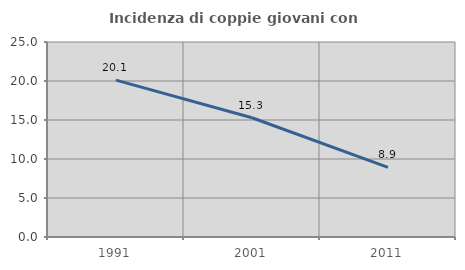
| Category | Incidenza di coppie giovani con figli |
|---|---|
| 1991.0 | 20.115 |
| 2001.0 | 15.293 |
| 2011.0 | 8.934 |